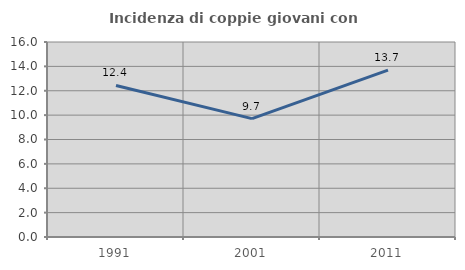
| Category | Incidenza di coppie giovani con figli |
|---|---|
| 1991.0 | 12.432 |
| 2001.0 | 9.714 |
| 2011.0 | 13.69 |